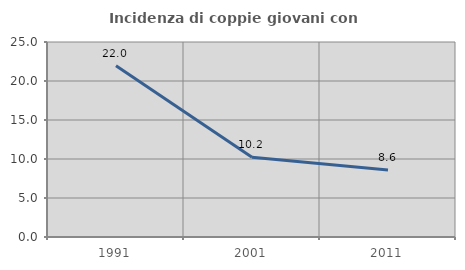
| Category | Incidenza di coppie giovani con figli |
|---|---|
| 1991.0 | 21.963 |
| 2001.0 | 10.222 |
| 2011.0 | 8.597 |